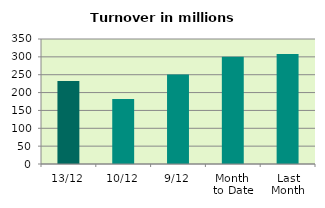
| Category | Series 0 |
|---|---|
| 13/12 | 232.597 |
| 10/12 | 181.652 |
| 9/12 | 250.851 |
| Month 
to Date | 300.269 |
| Last
Month | 307.664 |